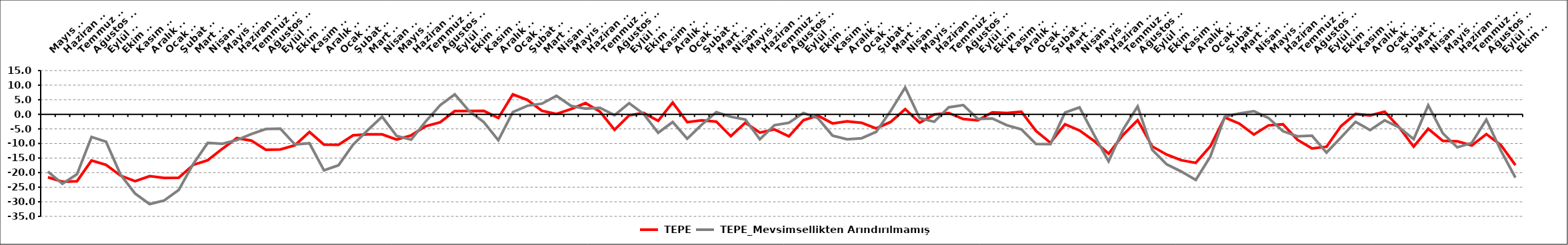
| Category |  TEPE |  TEPE_Mevsimsellikten Arındırılmamış Seri |
|---|---|---|
| 2008-05-01 | -21.581 | -19.633 |
| 2008-06-01 | -23.106 | -23.793 |
| 2008-07-01 | -22.939 | -20.565 |
| 2008-08-01 | -15.837 | -7.751 |
| 2008-09-01 | -17.334 | -9.403 |
| 2008-10-01 | -21.021 | -20.707 |
| 2008-11-01 | -22.907 | -27.167 |
| 2008-12-01 | -21.193 | -30.79 |
| 2009-01-01 | -21.822 | -29.544 |
| 2009-02-01 | -21.784 | -25.962 |
| 2009-03-01 | -17.347 | -17.051 |
| 2009-04-01 | -15.733 | -9.795 |
| 2009-05-01 | -11.836 | -10.09 |
| 2009-06-01 | -8.169 | -8.837 |
| 2009-07-01 | -9.015 | -6.786 |
| 2009-08-01 | -12.178 | -5.057 |
| 2009-09-01 | -12.039 | -4.927 |
| 2009-10-01 | -10.606 | -10.349 |
| 2009-11-01 | -6.056 | -9.929 |
| 2009-12-01 | -10.414 | -19.215 |
| 2010-01-01 | -10.465 | -17.472 |
| 2010-02-01 | -7.208 | -10.437 |
| 2010-03-01 | -6.86 | -5.497 |
| 2010-04-01 | -6.87 | -0.825 |
| 2010-05-01 | -8.679 | -7.438 |
| 2010-06-01 | -7.216 | -8.675 |
| 2010-07-01 | -4.075 | -2.47 |
| 2010-08-01 | -2.718 | 3.158 |
| 2010-09-01 | 1.119 | 6.833 |
| 2010-10-01 | 1.107 | 1.052 |
| 2010-11-01 | 1.197 | -2.695 |
| 2010-12-01 | -1.255 | -8.9 |
| 2011-01-01 | 6.834 | 0.759 |
| 2011-02-01 | 4.944 | 2.933 |
| 2011-03-01 | 1.198 | 3.667 |
| 2011-04-01 | 0.1 | 6.341 |
| 2011-05-01 | 1.793 | 2.898 |
| 2011-06-01 | 3.855 | 1.959 |
| 2011-07-01 | 0.886 | 2.203 |
| 2011-08-01 | -5.296 | -0.308 |
| 2011-09-01 | -0.359 | 3.828 |
| 2011-10-01 | 0.465 | 0.116 |
| 2011-11-01 | -2.251 | -6.323 |
| 2011-12-01 | 4.024 | -2.649 |
| 2012-01-01 | -2.67 | -8.384 |
| 2012-02-01 | -2.065 | -3.573 |
| 2012-03-01 | -2.51 | 0.71 |
| 2012-04-01 | -7.507 | -0.833 |
| 2012-05-01 | -2.87 | -1.781 |
| 2012-06-01 | -6.257 | -8.562 |
| 2012-07-01 | -5.172 | -3.742 |
| 2012-08-01 | -7.547 | -2.888 |
| 2012-09-01 | -2.013 | 0.466 |
| 2012-10-01 | -0.459 | -1.347 |
| 2012-11-01 | -3.119 | -7.29 |
| 2012-12-01 | -2.406 | -8.576 |
| 2013-01-01 | -2.901 | -8.218 |
| 2013-02-01 | -4.822 | -6.052 |
| 2013-03-02 | -2.619 | 1.133 |
| 2013-04-02 | 1.786 | 9.186 |
| 2013-05-02 | -2.86 | -1.337 |
| 2013-06-02 | -0.051 | -2.541 |
| 2013-07-02 | 0.455 | 2.4 |
| 2013-08-02 | -1.636 | 3.178 |
| 2013-09-02 | -2.059 | -1.593 |
| 2013-10-02 | 0.667 | -1.451 |
| 2013-11-02 | 0.449 | -3.756 |
| 2013-12-02 | 0.891 | -5.149 |
| 2014-01-02 | -5.666 | -10.153 |
| 2014-02-02 | -9.757 | -10.216 |
| 2014-03-02 | -3.405 | 0.59 |
| 2014-04-02 | -5.524 | 2.385 |
| 2014-05-02 | -9.128 | -7.02 |
| 2014-06-02 | -13.506 | -16.133 |
| 2014-07-02 | -7.055 | -5.183 |
| 2014-08-02 | -2.037 | 2.714 |
| 2014-09-02 | -10.997 | -12.14 |
| 2014-10-02 | -13.813 | -17.161 |
| 2014-11-02 | -15.731 | -19.609 |
| 2014-12-02 | -16.664 | -22.517 |
| 2015-01-02 | -10.978 | -14.52 |
| 2015-02-02 | -1.062 | -0.824 |
| 2015-03-02 | -3.208 | 0.295 |
| 2015-04-02 | -6.949 | 1.078 |
| 2015-05-02 | -3.8 | -1.233 |
| 2015-06-02 | -3.423 | -5.779 |
| 2015-07-02 | -8.729 | -7.52 |
| 2015-08-02 | -11.706 | -7.333 |
| 2015-09-02 | -11.11 | -13.131 |
| 2015-10-02 | -4.046 | -7.914 |
| 2015-11-02 | 0.128 | -2.563 |
| 2015-12-02 | -0.413 | -5.411 |
| 2016-01-02 | 0.931 | -2.07 |
| 2016-02-02 | -4.459 | -4.515 |
| 2016-03-02 | -11.104 | -8.539 |
| 2016-04-02 | -4.967 | 3.089 |
| 2016-05-02 | -9.111 | -6.484 |
| 2016-06-02 | -9.235 | -11.338 |
| 2016-07-03 | -10.685 | -9.8 |
| 2016-08-03 | -6.784 | -1.812 |
| 2016-09-03 | -10.549 | -12.433 |
| 2016-10-03 | -17.425 | -21.698 |